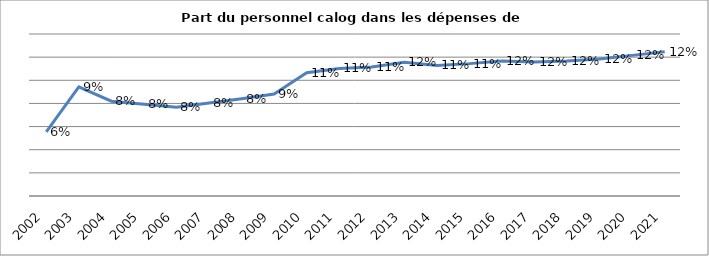
| Category | Series 0 |
|---|---|
| 2002.0 | 0.055 |
| 2003.0 | 0.094 |
| 2004.0 | 0.082 |
| 2005.0 | 0.079 |
| 2006.0 | 0.077 |
| 2007.0 | 0.08 |
| 2008.0 | 0.084 |
| 2009.0 | 0.088 |
| 2010.0 | 0.107 |
| 2011.0 | 0.11 |
| 2012.0 | 0.112 |
| 2013.0 | 0.116 |
| 2014.0 | 0.113 |
| 2015.0 | 0.114 |
| 2016.0 | 0.117 |
| 2017.0 | 0.116 |
| 2018.0 | 0.117 |
| 2019.0 | 0.118 |
| 2020.0 | 0.122 |
| 2021.0 | 0.125 |